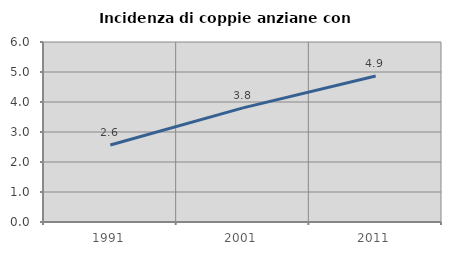
| Category | Incidenza di coppie anziane con figli |
|---|---|
| 1991.0 | 2.568 |
| 2001.0 | 3.803 |
| 2011.0 | 4.869 |